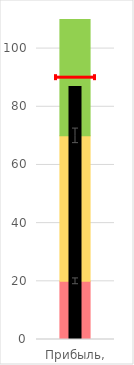
| Category | Плохо | Средне | Хорошо |
|---|---|---|---|
| Прибыль, млн | 20 | 50 | 40 |